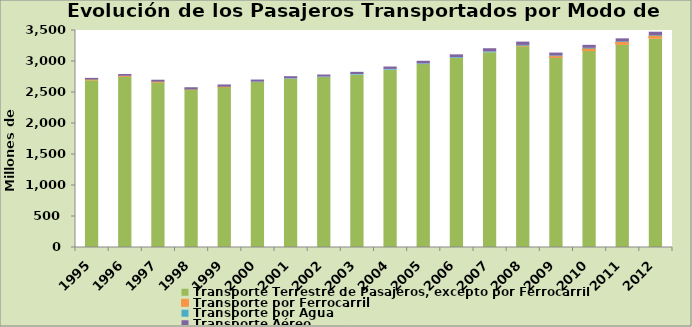
| Category | Transporte Terrestre de Pasajeros, excepto por Ferrocarril | Transporte por Ferrocarril | Transporte por Agua | Transporte Aéreo |
|---|---|---|---|---|
| 1995.0 | 2691 | 7 | 5 | 25 |
| 1996.0 | 2750 | 7 | 6 | 27 |
| 1997.0 | 2658 | 5 | 6 | 29 |
| 1998.0 | 2536 | 2 | 8 | 31 |
| 1999.0 | 2580 | 1 | 8 | 33 |
| 2000.0 | 2660 | 0 | 7 | 34 |
| 2001.0 | 2713 | 0 | 8 | 34 |
| 2002.0 | 2740 | 0 | 9 | 33 |
| 2003.0 | 2780 | 0 | 10 | 35 |
| 2004.0 | 2860 | 0 | 12 | 39 |
| 2005.0 | 2950 | 0 | 11.461 | 42.176 |
| 2006.0 | 3050 | 0 | 11.985 | 45.406 |
| 2007.0 | 3141 | 0 | 12.761 | 52.217 |
| 2008.0 | 3238 | 8.915 | 12.597 | 53.3 |
| 2009.0 | 3050 | 28 | 10.985 | 46.971 |
| 2010.0 | 3160 | 40.398 | 11.799 | 48.698 |
| 2011.0 | 3264.3 | 41.922 | 11.681 | 47.705 |
| 2012.0 | 3363 | 43.8 | 10.3 | 55.1 |